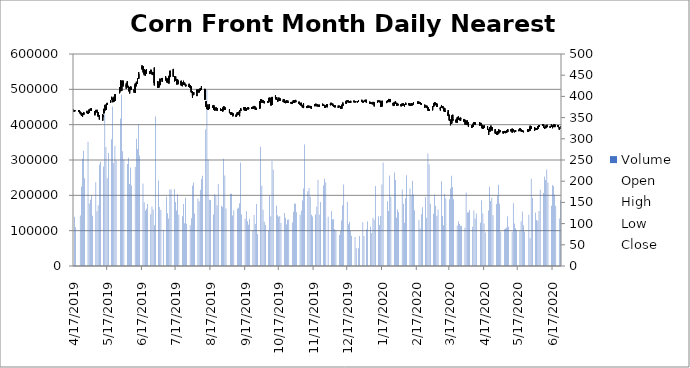
| Category | Volume |
|---|---|
| 4/17/19 | 139049 |
| 4/18/19 | 109463 |
| 4/22/19 | 142683 |
| 4/23/19 | 225078 |
| 4/24/19 | 303625 |
| 4/25/19 | 326054 |
| 4/26/19 | 248160 |
| 4/29/19 | 351765 |
| 4/30/19 | 177019 |
| 5/1/19 | 187350 |
| 5/2/19 | 201233 |
| 5/3/19 | 142124 |
| 5/6/19 | 236700 |
| 5/7/19 | 154884 |
| 5/8/19 | 172276 |
| 5/9/19 | 287094 |
| 5/10/19 | 295355 |
| 5/13/19 | 281888 |
| 5/14/19 | 429399 |
| 5/15/19 | 336989 |
| 5/16/19 | 248510 |
| 5/17/19 | 319503 |
| 5/20/19 | 358734 |
| 5/21/19 | 451260 |
| 5/22/19 | 291262 |
| 5/23/19 | 340117 |
| 5/24/19 | 299952 |
| 5/28/19 | 417683 |
| 5/29/19 | 484436 |
| 5/30/19 | 324914 |
| 5/31/19 | 302171 |
| 6/3/19 | 288442 |
| 6/4/19 | 306703 |
| 6/5/19 | 231859 |
| 6/6/19 | 279006 |
| 6/7/19 | 227751 |
| 6/10/19 | 279949 |
| 6/11/19 | 360317 |
| 6/12/19 | 331360 |
| 6/13/19 | 402152 |
| 6/14/19 | 312814 |
| 6/17/19 | 233248 |
| 6/18/19 | 180425 |
| 6/19/19 | 157137 |
| 6/20/19 | 162122 |
| 6/21/19 | 175127 |
| 6/24/19 | 146416 |
| 6/25/19 | 168334 |
| 6/26/19 | 159673 |
| 6/27/19 | 115259 |
| 6/28/19 | 423314 |
| 7/1/19 | 242245 |
| 7/2/19 | 166850 |
| 7/3/19 | 158276 |
| 7/5/19 | 102784 |
| 7/8/19 | 196442 |
| 7/9/19 | 148991 |
| 7/10/19 | 134463 |
| 7/11/19 | 216544 |
| 7/12/19 | 216745 |
| 7/15/19 | 218079 |
| 7/16/19 | 181286 |
| 7/17/19 | 157285 |
| 7/18/19 | 202738 |
| 7/19/19 | 144722 |
| 7/22/19 | 140656 |
| 7/23/19 | 175274 |
| 7/24/19 | 121099 |
| 7/25/19 | 193054 |
| 7/26/19 | 119490 |
| 7/29/19 | 115290 |
| 7/30/19 | 134937 |
| 7/31/19 | 226838 |
| 8/1/19 | 235995 |
| 8/2/19 | 148262 |
| 8/5/19 | 191120 |
| 8/6/19 | 183494 |
| 8/7/19 | 215638 |
| 8/8/19 | 246009 |
| 8/9/19 | 255682 |
| 8/12/19 | 387022 |
| 8/13/19 | 498116 |
| 8/14/19 | 301199 |
| 8/15/19 | 187487 |
| 8/16/19 | 186510 |
| 8/19/19 | 146028 |
| 8/20/19 | 203541 |
| 8/21/19 | 199565 |
| 8/22/19 | 171823 |
| 8/23/19 | 231913 |
| 8/26/19 | 170617 |
| 8/27/19 | 167220 |
| 8/28/19 | 303332 |
| 8/29/19 | 255872 |
| 8/30/19 | 162934 |
| 9/3/19 | 204262 |
| 9/4/19 | 204307 |
| 9/5/19 | 142572 |
| 9/6/19 | 157815 |
| 9/9/19 | 161790 |
| 9/10/19 | 164888 |
| 9/11/19 | 177888 |
| 9/12/19 | 293125 |
| 9/13/19 | 145836 |
| 9/16/19 | 133444 |
| 9/17/19 | 154625 |
| 9/18/19 | 126832 |
| 9/19/19 | 117069 |
| 9/20/19 | 132998 |
| 9/23/19 | 100443 |
| 9/24/19 | 144294 |
| 9/25/19 | 119189 |
| 9/26/19 | 175419 |
| 9/27/19 | 90796 |
| 9/30/19 | 337247 |
| 10/1/19 | 227065 |
| 10/2/19 | 158921 |
| 10/3/19 | 125489 |
| 10/4/19 | 116336 |
| 10/7/19 | 100421 |
| 10/8/19 | 200460 |
| 10/9/19 | 140853 |
| 10/10/19 | 297046 |
| 10/11/19 | 272436 |
| 10/14/19 | 170713 |
| 10/15/19 | 143675 |
| 10/16/19 | 139675 |
| 10/17/19 | 141532 |
| 10/18/19 | 122010 |
| 10/21/19 | 150187 |
| 10/22/19 | 136694 |
| 10/23/19 | 117561 |
| 10/24/19 | 130664 |
| 10/25/19 | 131677 |
| 10/28/19 | 122790 |
| 10/29/19 | 153732 |
| 10/30/19 | 177034 |
| 10/31/19 | 176193 |
| 11/1/19 | 151943 |
| 11/4/19 | 145373 |
| 11/5/19 | 157127 |
| 11/6/19 | 185339 |
| 11/7/19 | 219147 |
| 11/8/19 | 343769 |
| 11/11/19 | 211215 |
| 11/12/19 | 220513 |
| 11/13/19 | 195982 |
| 11/14/19 | 144893 |
| 11/15/19 | 140175 |
| 11/18/19 | 145739 |
| 11/19/19 | 167956 |
| 11/20/19 | 244176 |
| 11/21/19 | 145558 |
| 11/22/19 | 181211 |
| 11/25/19 | 228125 |
| 11/26/19 | 247043 |
| 11/27/19 | 237107 |
| 11/29/19 | 139171 |
| 12/2/19 | 155304 |
| 12/3/19 | 132389 |
| 12/4/19 | 132483 |
| 12/5/19 | 103730 |
| 12/6/19 | 101238 |
| 12/9/19 | 87766 |
| 12/10/19 | 98921 |
| 12/11/19 | 128564 |
| 12/12/19 | 171860 |
| 12/13/19 | 230831 |
| 12/16/19 | 180896 |
| 12/17/19 | 118236 |
| 12/18/19 | 125534 |
| 12/19/19 | 99129 |
| 12/20/19 | 85326 |
| 12/23/19 | 82257 |
| 12/24/19 | 50416 |
| 12/26/19 | 49930 |
| 12/27/19 | 85213 |
| 12/30/19 | 123528 |
| 12/31/19 | 85103 |
| 1/2/20 | 103987 |
| 1/3/20 | 125931 |
| 1/6/20 | 112130 |
| 1/7/20 | 93541 |
| 1/8/20 | 135523 |
| 1/9/20 | 130937 |
| 1/10/20 | 226659 |
| 1/13/20 | 139994 |
| 1/14/20 | 115957 |
| 1/15/20 | 141478 |
| 1/16/20 | 230557 |
| 1/17/20 | 293121 |
| 1/21/20 | 182958 |
| 1/22/20 | 155603 |
| 1/23/20 | 256298 |
| 1/24/20 | 196121 |
| 1/27/20 | 264471 |
| 1/28/20 | 243266 |
| 1/29/20 | 136811 |
| 1/30/20 | 160206 |
| 1/31/20 | 151805 |
| 2/3/20 | 216443 |
| 2/4/20 | 176002 |
| 2/5/20 | 122103 |
| 2/6/20 | 191891 |
| 2/7/20 | 256721 |
| 2/10/20 | 219017 |
| 2/11/20 | 200407 |
| 2/12/20 | 241461 |
| 2/13/20 | 202459 |
| 2/14/20 | 157804 |
| 2/18/20 | 130590 |
| 2/19/20 | 105945 |
| 2/20/20 | 146249 |
| 2/21/20 | 166266 |
| 2/24/20 | 195384 |
| 2/25/20 | 136869 |
| 2/26/20 | 318592 |
| 2/27/20 | 288213 |
| 2/28/20 | 176062 |
| 3/2/20 | 147782 |
| 3/3/20 | 202096 |
| 3/4/20 | 170361 |
| 3/5/20 | 142139 |
| 3/6/20 | 159898 |
| 3/9/20 | 239558 |
| 3/10/20 | 141727 |
| 3/11/20 | 115643 |
| 3/12/20 | 204283 |
| 3/13/20 | 191029 |
| 3/16/20 | 188791 |
| 3/17/20 | 219215 |
| 3/18/20 | 255105 |
| 3/19/20 | 223252 |
| 3/20/20 | 189068 |
| 3/23/20 | 114729 |
| 3/24/20 | 126658 |
| 3/25/20 | 118826 |
| 3/26/20 | 113530 |
| 3/27/20 | 114028 |
| 3/30/20 | 108485 |
| 3/31/20 | 208191 |
| 4/1/20 | 151929 |
| 4/2/20 | 151692 |
| 4/3/20 | 158652 |
| 4/6/20 | 111044 |
| 4/7/20 | 157368 |
| 4/8/20 | 134376 |
| 4/9/20 | 148850 |
| 4/13/20 | 122610 |
| 4/14/20 | 186072 |
| 4/15/20 | 148923 |
| 4/16/20 | 120053 |
| 4/17/20 | 95022 |
| 4/20/20 | 156913 |
| 4/21/20 | 224511 |
| 4/22/20 | 184119 |
| 4/23/20 | 193359 |
| 4/24/20 | 143376 |
| 4/27/20 | 175170 |
| 4/28/20 | 199148 |
| 4/29/20 | 230233 |
| 4/30/20 | 176650 |
| 5/1/20 | 97847 |
| 5/4/20 | 104063 |
| 5/5/20 | 105838 |
| 5/6/20 | 108455 |
| 5/7/20 | 140403 |
| 5/8/20 | 111275 |
| 5/11/20 | 97781 |
| 5/12/20 | 177591 |
| 5/13/20 | 120194 |
| 5/14/20 | 107147 |
| 5/15/20 | 101614 |
| 5/18/20 | 99372 |
| 5/19/20 | 126375 |
| 5/20/20 | 154473 |
| 5/21/20 | 115119 |
| 5/22/20 | 97188 |
| 5/26/20 | 145175 |
| 5/27/20 | 78423 |
| 5/28/20 | 246973 |
| 5/29/20 | 192310 |
| 6/1/20 | 151319 |
| 6/2/20 | 130469 |
| 6/3/20 | 128010 |
| 6/4/20 | 155612 |
| 6/5/20 | 215912 |
| 6/8/20 | 206335 |
| 6/9/20 | 253631 |
| 6/10/20 | 243286 |
| 6/11/20 | 272975 |
| 6/12/20 | 236621 |
| 6/15/20 | 170741 |
| 6/16/20 | 229095 |
| 6/17/20 | 225643 |
| 6/18/20 | 201444 |
| 6/19/20 | 170567 |
| 6/22/20 | 134480 |
| 6/23/20 | 185863 |
| 6/24/20 | 53723 |